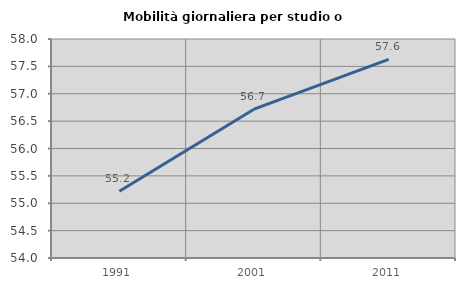
| Category | Mobilità giornaliera per studio o lavoro |
|---|---|
| 1991.0 | 55.218 |
| 2001.0 | 56.718 |
| 2011.0 | 57.626 |